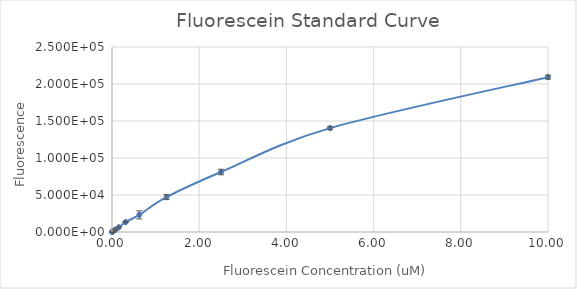
| Category | Series 0 |
|---|---|
| 10.0 | 209313.75 |
| 5.0 | 140341.25 |
| 2.5 | 81048.25 |
| 1.25 | 47156.5 |
| 0.625 | 23153.5 |
| 0.3125 | 13477.75 |
| 0.15625 | 6327 |
| 0.078125 | 3018.5 |
| 0.0390625 | 1841.25 |
| 0.01953125 | 887.5 |
| 0.009765625 | 463.5 |
| 0.0 | 10.75 |